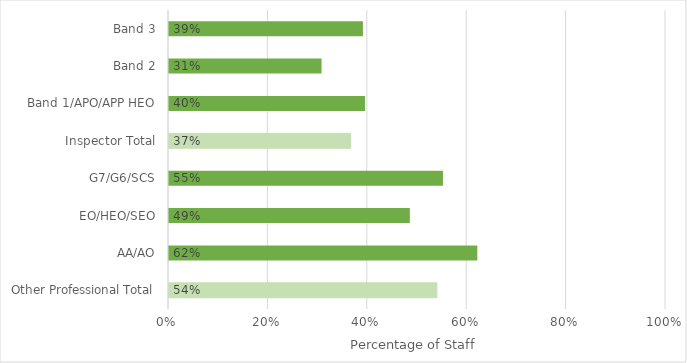
| Category | Series 0 |
|---|---|
| Other Professional Total | 0.541 |
| AA/AO | 0.622 |
| EO/HEO/SEO | 0.487 |
| G7/G6/SCS | 0.553 |
| Inspector Total | 0.368 |
| Band 1/APO/APP HEO | 0.396 |
| Band 2 | 0.309 |
| Band 3 | 0.392 |